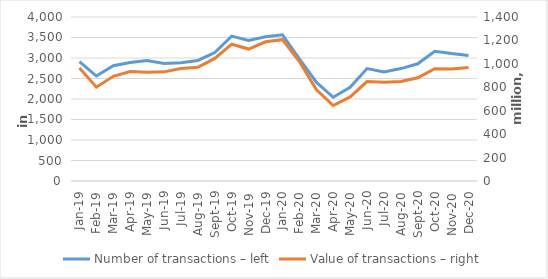
| Category | Number of transactions – left |
|---|---|
| 2019-01-01 | 2913979 |
| 2019-02-01 | 2560577 |
| 2019-03-01 | 2810234 |
| 2019-04-01 | 2888192 |
| 2019-05-01 | 2939289 |
| 2019-06-01 | 2863556 |
| 2019-07-01 | 2885572 |
| 2019-08-01 | 2940650 |
| 2019-09-01 | 3131352 |
| 2019-10-01 | 3533789 |
| 2019-11-01 | 3425425 |
| 2019-12-01 | 3519880 |
| 2020-01-01 | 3566905 |
| 2020-02-01 | 2979757 |
| 2020-03-01 | 2408904 |
| 2020-04-01 | 2042680 |
| 2020-05-01 | 2283539 |
| 2020-06-01 | 2743315 |
| 2020-07-01 | 2659954 |
| 2020-08-01 | 2741896 |
| 2020-09-01 | 2859464 |
| 2020-10-01 | 3165602 |
| 2020-11-01 | 3107930 |
| 2020-12-01 | 3062223 |